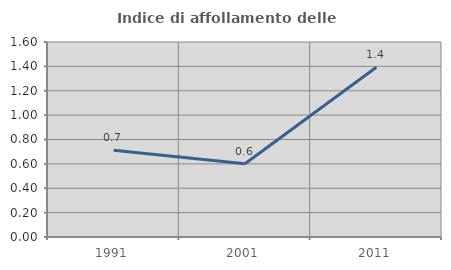
| Category | Indice di affollamento delle abitazioni  |
|---|---|
| 1991.0 | 0.712 |
| 2001.0 | 0.601 |
| 2011.0 | 1.393 |